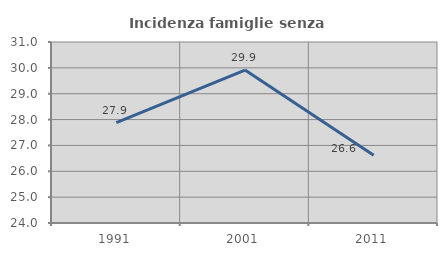
| Category | Incidenza famiglie senza nuclei |
|---|---|
| 1991.0 | 27.885 |
| 2001.0 | 29.915 |
| 2011.0 | 26.617 |